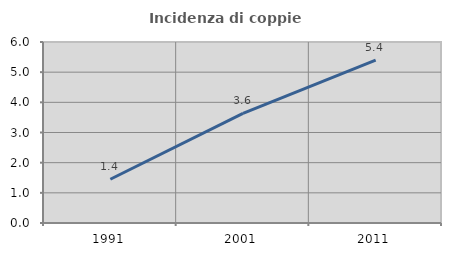
| Category | Incidenza di coppie miste |
|---|---|
| 1991.0 | 1.449 |
| 2001.0 | 3.636 |
| 2011.0 | 5.398 |